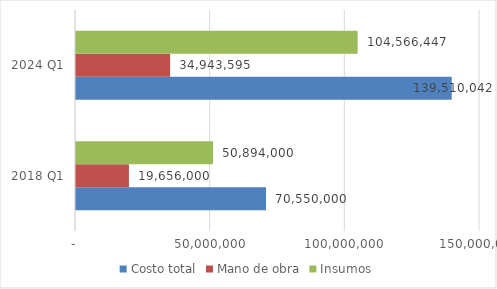
| Category | Costo total | Mano de obra | Insumos |
|---|---|---|---|
| 2018 Q1 | 70550000 | 19656000 | 50894000 |
| 2024 Q1 | 139510042.364 | 34943595 | 104566447.364 |